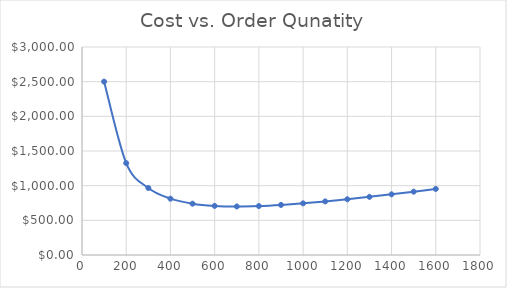
| Category | Series 0 |
|---|---|
| 100.0 | 2500 |
| 200.0 | 1325 |
| 300.0 | 966.667 |
| 400.0 | 812.5 |
| 500.0 | 740 |
| 600.0 | 708.333 |
| 700.0 | 700 |
| 800.0 | 706.25 |
| 900.0 | 722.222 |
| 1000.0 | 745 |
| 1100.0 | 772.727 |
| 1200.0 | 804.167 |
| 1300.0 | 838.462 |
| 1400.0 | 875 |
| 1500.0 | 913.333 |
| 1600.0 | 953.125 |